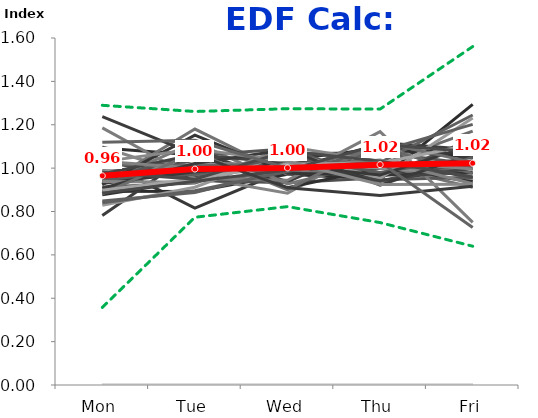
| Category | 1/4/16 | 1/11/16 | 1/18/16 | 1/25/16 | 2/1/16 | 2/8/16 | 2/15/16 | 2/22/16 | 2/29/16 | 3/7/16 | 3/14/16 | 3/21/16 | 3/28/16 | 4/4/16 | 4/11/16 | 4/18/16 | 4/25/16 | 5/2/16 | 5/9/16 | 5/16/16 | 5/23/16 | 5/30/16 | 6/6/16 | 6/13/16 | 6/20/16 | 6/27/16 | 7/4/16 | 7/11/16 | 7/18/16 | 7/25/16 | 8/1/16 | 8/8/16 | 8/15/16 | 8/22/16 | 8/29/16 | 9/5/16 | 9/12/16 | 9/19/16 | 9/26/16 | 10/3/16 | 10/10/16 | 10/17/16 | 10/24/16 | 10/31/16 | 11/7/16 | 11/14/16 | 11/21/16 | 11/28/16 | 12/5/16 | 12/12/16 | 12/19/16 | 12/26/16 | 1/2/17 | 1/9/17 | 1/16/17 | 1/23/17 | 1/30/17 | 2/6/17 | 2/13/17 | 2/20/17 | 2/27/17 | 3/6/17 | 3/13/17 | 3/20/17 | 3/27/17 | 4/3/17 | 4/10/17 | 4/17/17 | 4/24/17 | 5/1/17 | 5/8/17 | 5/15/17 | 5/22/17 | 5/29/17 | 6/5/17 | 6/12/17 | 6/19/17 | 6/26/17 | 7/3/17 | 7/10/17 | 7/17/17 | 7/24/17 | 7/31/17 | 8/7/17 | 8/14/17 | 8/21/17 | 8/28/17 | 9/4/17 | 9/11/17 | 9/18/17 | 9/25/17 | 10/2/17 | 10/9/17 | 10/16/17 | 10/23/17 | 10/30/17 | 11/6/17 | 11/13/17 | 11/20/17 | 11/27/17 | 12/4/17 | 12/11/17 | 12/18/17 | 12/25/17 | 1/1/18 | 1/8/18 | 1/15/18 | 1/22/18 | 1/29/18 | 2/5/18 | 2/12/18 | 2/19/18 | 2/26/18 | 3/5/18 | 3/12/18 | 3/19/18 | 3/26/18 | 4/2/18 | 4/9/18 | 4/16/18 | 4/23/18 | 4/30/18 | 5/7/18 | 5/14/18 | 5/21/18 | 5/28/18 | 6/4/18 | 6/11/18 | 6/18/18 | 6/25/18 | 7/2/18 | 7/9/18 | 7/16/18 | 7/23/18 | 7/30/18 | 8/6/18 | 8/13/18 | 8/20/18 | 8/27/18 | 9/3/18 | 9/10/18 | 9/17/18 | 9/24/18 | 10/1/18 | 10/8/18 | 10/15/18 | 10/22/18 | 10/29/18 | 11/5/18 | 11/12/18 | 11/19/18 | 11/26/18 | 12/3/18 | 12/10/18 | 12/17/18 | 12/24/18 | 12/31/18 | 1/7/19 | 1/14/19 | 1/21/19 | 1/28/19 | 2/4/19 | 2/11/19 | 2/18/19 | 2/25/19 | 3/4/19 | 3/11/19 | 3/18/19 | 3/25/19 | 4/1/19 | 4/8/19 | 4/15/19 | 4/22/19 | 4/29/19 | 5/6/19 | 5/13/19 | 5/20/19 | 5/27/19 | 6/3/19 | 6/10/19 | 6/17/19 | 6/24/19 | 7/1/19 | 7/8/19 | 7/15/19 | 7/22/19 | 7/29/19 | 8/5/19 | 8/12/19 | 8/19/19 | 8/26/19 | 9/2/19 | 9/9/19 | 9/16/19 | 9/23/19 | 9/30/19 | 10/7/19 | 10/14/19 | 10/21/19 | 10/28/19 | 11/4/19 | 11/11/19 | 11/18/19 | 11/25/19 | 12/2/19 | 12/9/19 | 12/16/19 | 12/23/19 | 12/30/19 | 1/6/20 | 1/13/20 | 1/20/20 | 1/27/20 | 2/3/20 | 2/10/20 | 2/17/20 | 2/24/20 | 3/2/20 | 3/9/20 | 3/16/20 | 3/23/20 | 3/30/20 | 4/6/20 | 4/13/20 | 4/20/20 | 4/27/20 | 5/4/20 | 5/11/20 | 5/18/20 | 5/25/20 | 6/1/20 | 6/8/20 | 6/15/20 | 6/22/20 | 6/29/20 | 7/6/20 | 7/13/20 | 7/20/20 | 7/27/20 | 8/3/20 | 8/10/20 | 8/17/20 | 8/24/20 | 8/31/20 | 9/7/20 | 9/14/20 | 9/21/20 | 9/28/20 | 10/5/20 | 10/12/20 | 10/19/20 | Min: | Max: | FINAL: |
|---|---|---|---|---|---|---|---|---|---|---|---|---|---|---|---|---|---|---|---|---|---|---|---|---|---|---|---|---|---|---|---|---|---|---|---|---|---|---|---|---|---|---|---|---|---|---|---|---|---|---|---|---|---|---|---|---|---|---|---|---|---|---|---|---|---|---|---|---|---|---|---|---|---|---|---|---|---|---|---|---|---|---|---|---|---|---|---|---|---|---|---|---|---|---|---|---|---|---|---|---|---|---|---|---|---|---|---|---|---|---|---|---|---|---|---|---|---|---|---|---|---|---|---|---|---|---|---|---|---|---|---|---|---|---|---|---|---|---|---|---|---|---|---|---|---|---|---|---|---|---|---|---|---|---|---|---|---|---|---|---|---|---|---|---|---|---|---|---|---|---|---|---|---|---|---|---|---|---|---|---|---|---|---|---|---|---|---|---|---|---|---|---|---|---|---|---|---|---|---|---|---|---|---|---|---|---|---|---|---|---|---|---|---|---|---|---|---|---|---|---|---|---|---|---|---|---|---|---|---|---|---|---|---|---|---|---|---|---|---|---|---|---|---|---|---|---|---|---|---|---|---|---|---|---|
| Mon | 1.031 | 0.893 | 0 | 0.894 | 0.913 | 1.097 | 0 | 0.989 | 1.034 | 1.092 | 0 | 0 | 0.782 | 0.923 | 0.938 | 0.878 | 0.848 | 0.985 | 1.034 | 0.929 | 0.949 | 0 | 1.016 | 0 | 0 | 1.185 | 0 | 0.925 | 0.962 | 0.829 | 0.973 | 1.032 | 0.945 | 0.929 | 0 | 0 | 0 | 0.939 | 0.84 | 0.907 | 0.882 | 0.898 | 0.885 | 1.03 | 0 | 1.237 | 0 | 0 | 0.981 | 0 | 1.119 | 0 | 0 | 0 | 0 | 0 | 0 | 0 | 0 | 0 | 0 | 0 | 0 | 0 | 0 | 0 | 0 | 0 | 0 | 0 | 0 | 0 | 0 | 0 | 0 | 0 | 0 | 0 | 0 | 0 | 0 | 0 | 0 | 0 | 0 | 0 | 0 | 0 | 0 | 0 | 0 | 0 | 0 | 0 | 0 | 0 | 0 | 0 | 0 | 0 | 0 | 0 | 0 | 0 | 0 | 0 | 0 | 0 | 0 | 0 | 0 | 0 | 0 | 0 | 0 | 0 | 0 | 0 | 0 | 0 | 0 | 0 | 0 | 0 | 0 | 0 | 0 | 0 | 0 | 0 | 0 | 0 | 0 | 0 | 0 | 0 | 0 | 0 | 0 | 0 | 0 | 0 | 0 | 0 | 0 | 0 | 0 | 0 | 0 | 0 | 0 | 0 | 0 | 0 | 0 | 0 | 0 | 0 | 0 | 0 | 0 | 0 | 0 | 0 | 0 | 0 | 0 | 0 | 0 | 0 | 0 | 0 | 0 | 0 | 0 | 0 | 0 | 0 | 0 | 0 | 0 | 0 | 0 | 0 | 0 | 0 | 0 | 0 | 0 | 0 | 0 | 0 | 0 | 0 | 0 | 0 | 0 | 0 | 0 | 0 | 0 | 0 | 0 | 0 | 0 | 0 | 0 | 0 | 0 | 0 | 0 | 0 | 0 | 0 | 0 | 0 | 0 | 0 | 0 | 0 | 0 | 0 | 0 | 0 | 0 | 0 | 0 | 0 | 0 | 0 | 0 | 0 | 0 | 0 | 0 | 0 | 0 | 0 | 0 | 0 | 0 | 0 | 0 | 0 | 0 | 0 | 0 | 0 | 0 | 0 | 0 | 0.358 | 1.29 | 0.965 |
| Tue | 0.816 | 0.94 | 0 | 0.892 | 0.931 | 0.959 | 0 | 0.963 | 0.943 | 1.061 | 0 | 0 | 1.077 | 1.18 | 1.037 | 0.944 | 0.888 | 1.018 | 0.955 | 1.118 | 1.058 | 0 | 1.011 | 0 | 0 | 0.952 | 0 | 1.152 | 0.973 | 0.912 | 1.063 | 1 | 0.972 | 0.984 | 0 | 0 | 0 | 0.935 | 0.896 | 1.022 | 1.072 | 0.951 | 0.94 | 1.089 | 0 | 1.063 | 0 | 0 | 0.949 | 0 | 1.128 | 0 | 0 | 0 | 0 | 0 | 0 | 0 | 0 | 0 | 0 | 0 | 0 | 0 | 0 | 0 | 0 | 0 | 0 | 0 | 0 | 0 | 0 | 0 | 0 | 0 | 0 | 0 | 0 | 0 | 0 | 0 | 0 | 0 | 0 | 0 | 0 | 0 | 0 | 0 | 0 | 0 | 0 | 0 | 0 | 0 | 0 | 0 | 0 | 0 | 0 | 0 | 0 | 0 | 0 | 0 | 0 | 0 | 0 | 0 | 0 | 0 | 0 | 0 | 0 | 0 | 0 | 0 | 0 | 0 | 0 | 0 | 0 | 0 | 0 | 0 | 0 | 0 | 0 | 0 | 0 | 0 | 0 | 0 | 0 | 0 | 0 | 0 | 0 | 0 | 0 | 0 | 0 | 0 | 0 | 0 | 0 | 0 | 0 | 0 | 0 | 0 | 0 | 0 | 0 | 0 | 0 | 0 | 0 | 0 | 0 | 0 | 0 | 0 | 0 | 0 | 0 | 0 | 0 | 0 | 0 | 0 | 0 | 0 | 0 | 0 | 0 | 0 | 0 | 0 | 0 | 0 | 0 | 0 | 0 | 0 | 0 | 0 | 0 | 0 | 0 | 0 | 0 | 0 | 0 | 0 | 0 | 0 | 0 | 0 | 0 | 0 | 0 | 0 | 0 | 0 | 0 | 0 | 0 | 0 | 0 | 0 | 0 | 0 | 0 | 0 | 0 | 0 | 0 | 0 | 0 | 0 | 0 | 0 | 0 | 0 | 0 | 0 | 0 | 0 | 0 | 0 | 0 | 0 | 0 | 0 | 0 | 0 | 0 | 0 | 0 | 0 | 0 | 0 | 0 | 0 | 0 | 0 | 0 | 0 | 0 | 0.774 | 1.261 | 0.996 |
| Wed | 0.994 | 0.98 | 0 | 0.971 | 1.064 | 0.884 | 0 | 1.046 | 0.933 | 0.91 | 0 | 0 | 0.938 | 0.97 | 1.054 | 1.04 | 0.993 | 1.024 | 1.022 | 0.927 | 1.089 | 0 | 1.02 | 0 | 0 | 0.944 | 0 | 0.976 | 0.995 | 1.075 | 1.022 | 1.004 | 1.053 | 1.012 | 0 | 0 | 0 | 1.099 | 0.985 | 1.086 | 0.9 | 1.019 | 0.991 | 1.031 | 0 | 0.909 | 0 | 0 | 1.079 | 0 | 0.999 | 0 | 0 | 0 | 0 | 0 | 0 | 0 | 0 | 0 | 0 | 0 | 0 | 0 | 0 | 0 | 0 | 0 | 0 | 0 | 0 | 0 | 0 | 0 | 0 | 0 | 0 | 0 | 0 | 0 | 0 | 0 | 0 | 0 | 0 | 0 | 0 | 0 | 0 | 0 | 0 | 0 | 0 | 0 | 0 | 0 | 0 | 0 | 0 | 0 | 0 | 0 | 0 | 0 | 0 | 0 | 0 | 0 | 0 | 0 | 0 | 0 | 0 | 0 | 0 | 0 | 0 | 0 | 0 | 0 | 0 | 0 | 0 | 0 | 0 | 0 | 0 | 0 | 0 | 0 | 0 | 0 | 0 | 0 | 0 | 0 | 0 | 0 | 0 | 0 | 0 | 0 | 0 | 0 | 0 | 0 | 0 | 0 | 0 | 0 | 0 | 0 | 0 | 0 | 0 | 0 | 0 | 0 | 0 | 0 | 0 | 0 | 0 | 0 | 0 | 0 | 0 | 0 | 0 | 0 | 0 | 0 | 0 | 0 | 0 | 0 | 0 | 0 | 0 | 0 | 0 | 0 | 0 | 0 | 0 | 0 | 0 | 0 | 0 | 0 | 0 | 0 | 0 | 0 | 0 | 0 | 0 | 0 | 0 | 0 | 0 | 0 | 0 | 0 | 0 | 0 | 0 | 0 | 0 | 0 | 0 | 0 | 0 | 0 | 0 | 0 | 0 | 0 | 0 | 0 | 0 | 0 | 0 | 0 | 0 | 0 | 0 | 0 | 0 | 0 | 0 | 0 | 0 | 0 | 0 | 0 | 0 | 0 | 0 | 0 | 0 | 0 | 0 | 0 | 0 | 0 | 0 | 0 | 0 | 0 | 0 | 0.822 | 1.274 | 1.001 |
| Thu | 1.109 | 1.016 | 0 | 0.949 | 1.073 | 1.118 | 0 | 0.969 | 0.956 | 1 | 0 | 0 | 1.118 | 1.015 | 0.941 | 1.09 | 1.025 | 1 | 1.033 | 1.031 | 0.946 | 0 | 0.939 | 0 | 0 | 1.169 | 0 | 0.967 | 1.094 | 0.953 | 0.942 | 1.037 | 0.98 | 0.968 | 0 | 0 | 0 | 1.031 | 1.078 | 0.921 | 1.12 | 1.022 | 1.109 | 0.925 | 0 | 0.874 | 0 | 0 | 1.032 | 0 | 1.028 | 0 | 0 | 0 | 0 | 0 | 0 | 0 | 0 | 0 | 0 | 0 | 0 | 0 | 0 | 0 | 0 | 0 | 0 | 0 | 0 | 0 | 0 | 0 | 0 | 0 | 0 | 0 | 0 | 0 | 0 | 0 | 0 | 0 | 0 | 0 | 0 | 0 | 0 | 0 | 0 | 0 | 0 | 0 | 0 | 0 | 0 | 0 | 0 | 0 | 0 | 0 | 0 | 0 | 0 | 0 | 0 | 0 | 0 | 0 | 0 | 0 | 0 | 0 | 0 | 0 | 0 | 0 | 0 | 0 | 0 | 0 | 0 | 0 | 0 | 0 | 0 | 0 | 0 | 0 | 0 | 0 | 0 | 0 | 0 | 0 | 0 | 0 | 0 | 0 | 0 | 0 | 0 | 0 | 0 | 0 | 0 | 0 | 0 | 0 | 0 | 0 | 0 | 0 | 0 | 0 | 0 | 0 | 0 | 0 | 0 | 0 | 0 | 0 | 0 | 0 | 0 | 0 | 0 | 0 | 0 | 0 | 0 | 0 | 0 | 0 | 0 | 0 | 0 | 0 | 0 | 0 | 0 | 0 | 0 | 0 | 0 | 0 | 0 | 0 | 0 | 0 | 0 | 0 | 0 | 0 | 0 | 0 | 0 | 0 | 0 | 0 | 0 | 0 | 0 | 0 | 0 | 0 | 0 | 0 | 0 | 0 | 0 | 0 | 0 | 0 | 0 | 0 | 0 | 0 | 0 | 0 | 0 | 0 | 0 | 0 | 0 | 0 | 0 | 0 | 0 | 0 | 0 | 0 | 0 | 0 | 0 | 0 | 0 | 0 | 0 | 0 | 0 | 0 | 0 | 0 | 0 | 0 | 0 | 0 | 0 | 0.749 | 1.272 | 1.016 |
| Fri | 1.05 | 1.17 | 0 | 1.294 | 1.018 | 0.941 | 0 | 1.034 | 1.134 | 0.937 | 0 | 0 | 1.085 | 0.911 | 1.03 | 1.048 | 1.245 | 0.974 | 0.957 | 0.995 | 0.958 | 0 | 1.014 | 0 | 0 | 0.75 | 0 | 0.98 | 0.976 | 1.231 | 0.999 | 0.928 | 1.05 | 1.107 | 0 | 0 | 0 | 0.996 | 1.202 | 1.065 | 1.026 | 1.11 | 1.075 | 0.926 | 0 | 0.917 | 0 | 0 | 0.959 | 0 | 0.726 | 0 | 0 | 0 | 0 | 0 | 0 | 0 | 0 | 0 | 0 | 0 | 0 | 0 | 0 | 0 | 0 | 0 | 0 | 0 | 0 | 0 | 0 | 0 | 0 | 0 | 0 | 0 | 0 | 0 | 0 | 0 | 0 | 0 | 0 | 0 | 0 | 0 | 0 | 0 | 0 | 0 | 0 | 0 | 0 | 0 | 0 | 0 | 0 | 0 | 0 | 0 | 0 | 0 | 0 | 0 | 0 | 0 | 0 | 0 | 0 | 0 | 0 | 0 | 0 | 0 | 0 | 0 | 0 | 0 | 0 | 0 | 0 | 0 | 0 | 0 | 0 | 0 | 0 | 0 | 0 | 0 | 0 | 0 | 0 | 0 | 0 | 0 | 0 | 0 | 0 | 0 | 0 | 0 | 0 | 0 | 0 | 0 | 0 | 0 | 0 | 0 | 0 | 0 | 0 | 0 | 0 | 0 | 0 | 0 | 0 | 0 | 0 | 0 | 0 | 0 | 0 | 0 | 0 | 0 | 0 | 0 | 0 | 0 | 0 | 0 | 0 | 0 | 0 | 0 | 0 | 0 | 0 | 0 | 0 | 0 | 0 | 0 | 0 | 0 | 0 | 0 | 0 | 0 | 0 | 0 | 0 | 0 | 0 | 0 | 0 | 0 | 0 | 0 | 0 | 0 | 0 | 0 | 0 | 0 | 0 | 0 | 0 | 0 | 0 | 0 | 0 | 0 | 0 | 0 | 0 | 0 | 0 | 0 | 0 | 0 | 0 | 0 | 0 | 0 | 0 | 0 | 0 | 0 | 0 | 0 | 0 | 0 | 0 | 0 | 0 | 0 | 0 | 0 | 0 | 0 | 0 | 0 | 0 | 0 | 0 | 0.64 | 1.561 | 1.023 |